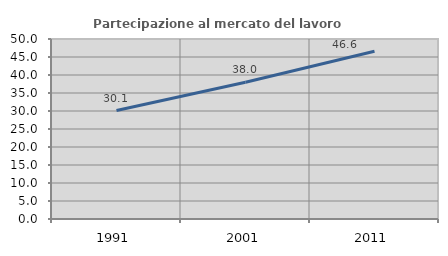
| Category | Partecipazione al mercato del lavoro  femminile |
|---|---|
| 1991.0 | 30.134 |
| 2001.0 | 38 |
| 2011.0 | 46.575 |